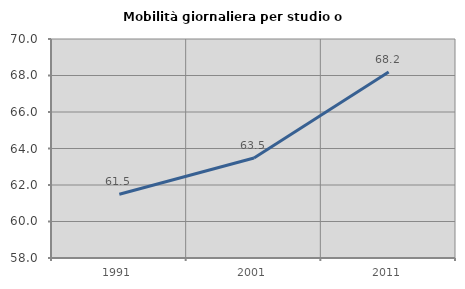
| Category | Mobilità giornaliera per studio o lavoro |
|---|---|
| 1991.0 | 61.497 |
| 2001.0 | 63.475 |
| 2011.0 | 68.192 |